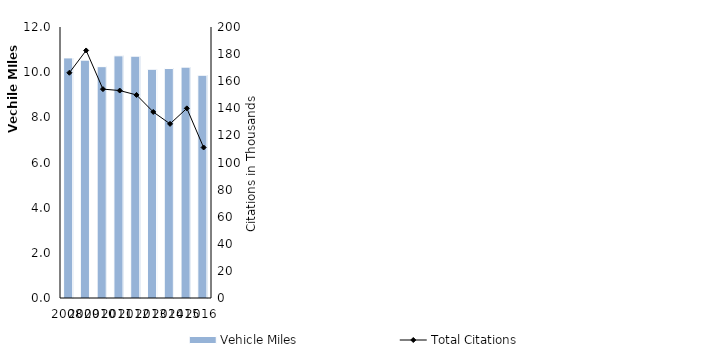
| Category | Vehicle Miles |
|---|---|
| 2008.0 | 10631243 |
| 2009.0 | 10531679 |
| 2010.0 | 10243362 |
| 2011.0 | 10723029 |
| 2012.0 | 10707766 |
| 2013.0 | 10128313 |
| 2014.0 | 10161541 |
| 2015.0 | 10222855 |
| 2016.0 | 9863967 |